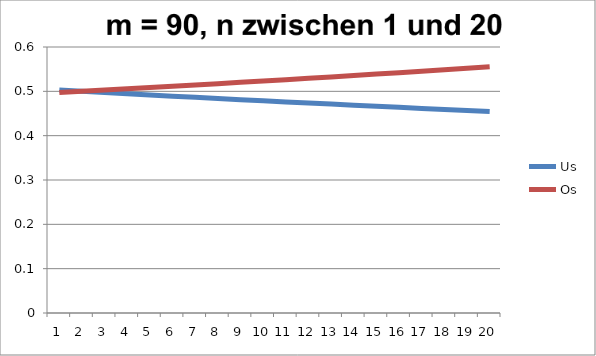
| Category | Us | Os |
|---|---|---|
| 0 | 0.503 | 0.497 |
| 1 | 0.5 | 0.5 |
| 2 | 0.497 | 0.503 |
| 3 | 0.495 | 0.506 |
| 4 | 0.492 | 0.508 |
| 5 | 0.489 | 0.511 |
| 6 | 0.486 | 0.514 |
| 7 | 0.484 | 0.517 |
| 8 | 0.481 | 0.52 |
| 9 | 0.479 | 0.523 |
| 10 | 0.476 | 0.526 |
| 11 | 0.474 | 0.529 |
| 12 | 0.471 | 0.533 |
| 13 | 0.469 | 0.536 |
| 14 | 0.466 | 0.539 |
| 15 | 0.464 | 0.542 |
| 16 | 0.462 | 0.545 |
| 17 | 0.459 | 0.549 |
| 18 | 0.457 | 0.552 |
| 19 | 0.455 | 0.556 |